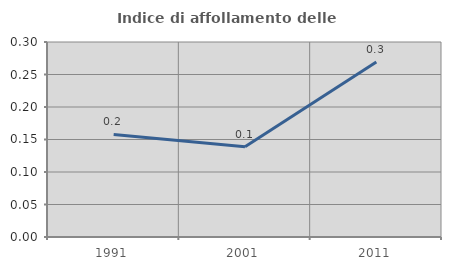
| Category | Indice di affollamento delle abitazioni  |
|---|---|
| 1991.0 | 0.158 |
| 2001.0 | 0.139 |
| 2011.0 | 0.269 |